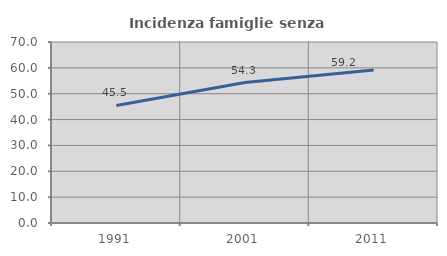
| Category | Incidenza famiglie senza nuclei |
|---|---|
| 1991.0 | 45.455 |
| 2001.0 | 54.321 |
| 2011.0 | 59.211 |